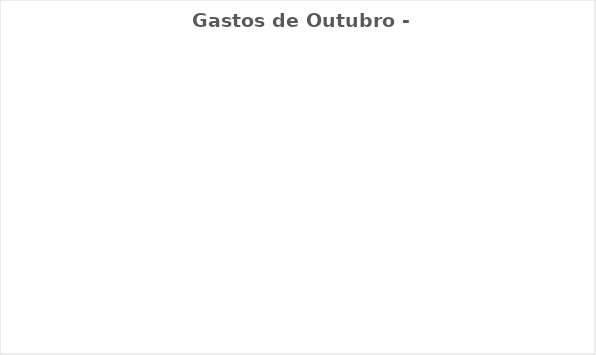
| Category | Gastos de Outubro - Real |
|---|---|
| Despesas Mensais | 0 |
| Aposentadoria/Pagar à si | 0 |
| Gratidão/ Doação/ Dizimo | 0 |
| Desejos | 0 |
| Dívidas/Investimentos | 0 |